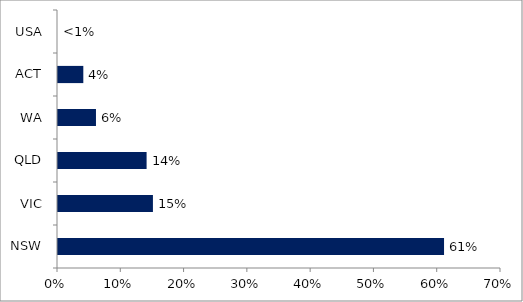
| Category | Series 0 |
|---|---|
| NSW | 0.61 |
| VIC | 0.15 |
| QLD | 0.14 |
| WA | 0.06 |
| ACT | 0.04 |
| USA | 0 |